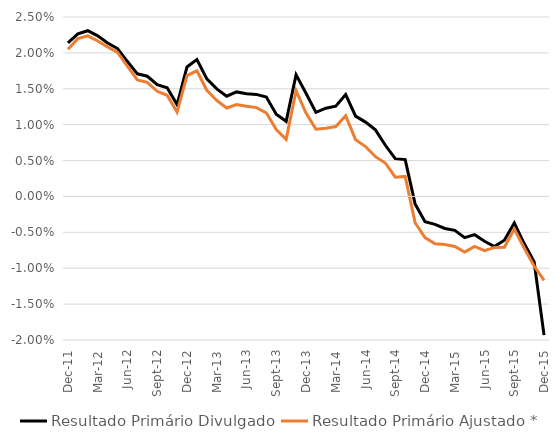
| Category | Resultado Primário Divulgado | Resultado Primário Ajustado * |
|---|---|---|
| 2011-12-01 | 0.021 | 0.021 |
| 2012-01-01 | 0.023 | 0.022 |
| 2012-02-01 | 0.023 | 0.022 |
| 2012-03-01 | 0.022 | 0.022 |
| 2012-04-01 | 0.021 | 0.021 |
| 2012-05-01 | 0.021 | 0.02 |
| 2012-06-01 | 0.019 | 0.018 |
| 2012-07-01 | 0.017 | 0.016 |
| 2012-08-01 | 0.017 | 0.016 |
| 2012-09-01 | 0.016 | 0.015 |
| 2012-10-01 | 0.015 | 0.014 |
| 2012-11-01 | 0.013 | 0.012 |
| 2012-12-01 | 0.018 | 0.017 |
| 2013-01-01 | 0.019 | 0.017 |
| 2013-02-01 | 0.016 | 0.015 |
| 2013-03-01 | 0.015 | 0.013 |
| 2013-04-01 | 0.014 | 0.012 |
| 2013-05-01 | 0.015 | 0.013 |
| 2013-06-01 | 0.014 | 0.013 |
| 2013-07-01 | 0.014 | 0.012 |
| 2013-08-01 | 0.014 | 0.012 |
| 2013-09-01 | 0.011 | 0.009 |
| 2013-10-01 | 0.01 | 0.008 |
| 2013-11-01 | 0.017 | 0.015 |
| 2013-12-01 | 0.014 | 0.012 |
| 2014-01-01 | 0.012 | 0.009 |
| 2014-02-01 | 0.012 | 0.01 |
| 2014-03-01 | 0.013 | 0.01 |
| 2014-04-01 | 0.014 | 0.011 |
| 2014-05-01 | 0.011 | 0.008 |
| 2014-06-01 | 0.01 | 0.007 |
| 2014-07-01 | 0.009 | 0.006 |
| 2014-08-01 | 0.007 | 0.005 |
| 2014-09-01 | 0.005 | 0.003 |
| 2014-10-01 | 0.005 | 0.003 |
| 2014-11-01 | -0.001 | -0.004 |
| 2014-12-01 | -0.004 | -0.006 |
| 2015-01-01 | -0.004 | -0.007 |
| 2015-02-01 | -0.004 | -0.007 |
| 2015-03-01 | -0.005 | -0.007 |
| 2015-04-01 | -0.006 | -0.008 |
| 2015-05-01 | -0.005 | -0.007 |
| 2015-06-01 | -0.006 | -0.008 |
| 2015-07-01 | -0.007 | -0.007 |
| 2015-08-01 | -0.006 | -0.007 |
| 2015-09-01 | -0.004 | -0.005 |
| 2015-10-01 | -0.007 | -0.007 |
| 2015-11-01 | -0.009 | -0.01 |
| 2015-12-01 | -0.019 | -0.012 |